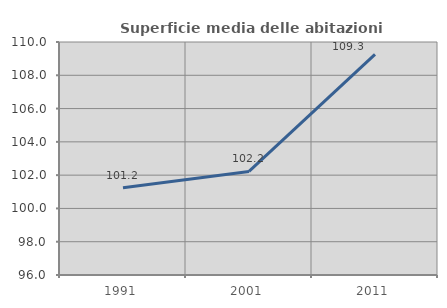
| Category | Superficie media delle abitazioni occupate |
|---|---|
| 1991.0 | 101.239 |
| 2001.0 | 102.221 |
| 2011.0 | 109.256 |